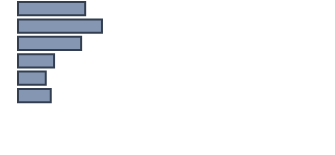
| Category | Series 0 |
|---|---|
| 0 | 21.6 |
| 1 | 27 |
| 2 | 20.3 |
| 3 | 11.6 |
| 4 | 8.9 |
| 5 | 10.5 |
| 6 | 0 |
| 7 | 0 |